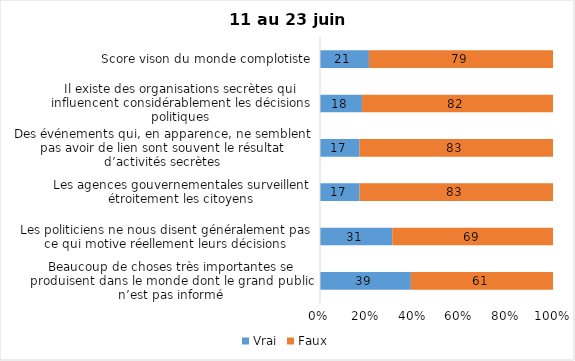
| Category | Vrai | Faux |
|---|---|---|
| Beaucoup de choses très importantes se produisent dans le monde dont le grand public n’est pas informé | 39 | 61 |
| Les politiciens ne nous disent généralement pas ce qui motive réellement leurs décisions | 31 | 69 |
| Les agences gouvernementales surveillent étroitement les citoyens | 17 | 83 |
| Des événements qui, en apparence, ne semblent pas avoir de lien sont souvent le résultat d’activités secrètes | 17 | 83 |
| Il existe des organisations secrètes qui influencent considérablement les décisions politiques | 18 | 82 |
| Score vison du monde complotiste | 21 | 79 |